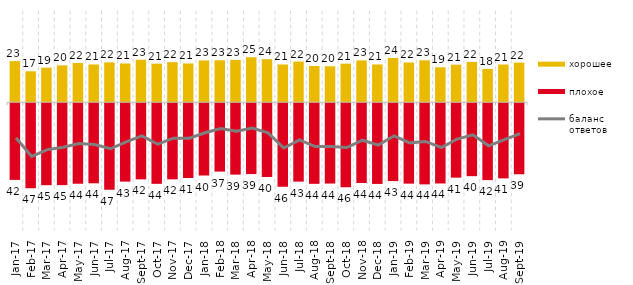
| Category | хорошее | плохое |
|---|---|---|
| 2017-01-01 | 22.55 | -42 |
| 2017-02-01 | 16.95 | -46.6 |
| 2017-03-01 | 18.95 | -44.9 |
| 2017-04-01 | 20.2 | -44.85 |
| 2017-05-01 | 21.5 | -44.1 |
| 2017-06-01 | 20.7 | -43.85 |
| 2017-07-01 | 21.85 | -47.35 |
| 2017-08-01 | 21.25 | -42.95 |
| 2017-09-01 | 23.3 | -41.7 |
| 2017-10-01 | 21.15 | -44.15 |
| 2017-11-01 | 22 | -41.7 |
| 2017-12-01 | 21.25 | -40.95 |
| 2018-01-01 | 22.9 | -39.6 |
| 2018-02-01 | 23 | -37.45 |
| 2018-03-01 | 23.2 | -39.1 |
| 2018-04-01 | 24.65 | -38.8 |
| 2018-05-01 | 23.6 | -40.4 |
| 2018-06-01 | 20.7 | -45.75 |
| 2018-07-01 | 22.3 | -42.95 |
| 2018-08-01 | 19.85 | -44.15 |
| 2018-09-01 | 19.7 | -44 |
| 2018-10-01 | 21.15 | -46 |
| 2018-11-01 | 22.904 | -43.713 |
| 2018-12-01 | 20.7 | -44.2 |
| 2019-01-01 | 24.25 | -42.65 |
| 2019-02-01 | 21.8 | -44.05 |
| 2019-03-01 | 22.974 | -44.455 |
| 2019-04-01 | 19.158 | -43.96 |
| 2019-05-01 | 20.604 | -40.763 |
| 2019-06-01 | 22.095 | -39.95 |
| 2019-07-01 | 18.267 | -42.129 |
| 2019-08-01 | 20.679 | -41.159 |
| 2019-09-01 | 21.733 | -38.911 |